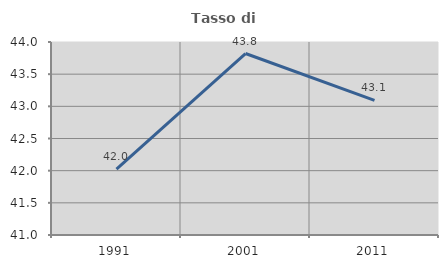
| Category | Tasso di occupazione   |
|---|---|
| 1991.0 | 42.024 |
| 2001.0 | 43.821 |
| 2011.0 | 43.092 |